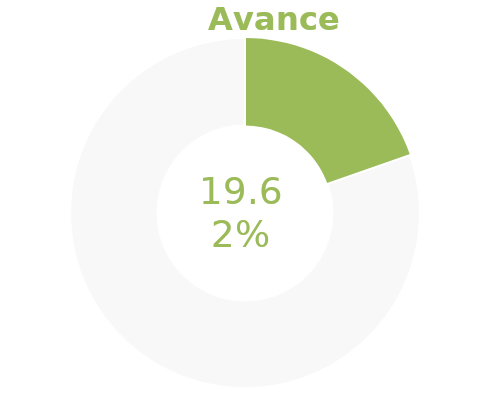
| Category | Series 0 |
|---|---|
| Acumulado 1 Trimestre | 0.196 |
| Año | -0.804 |